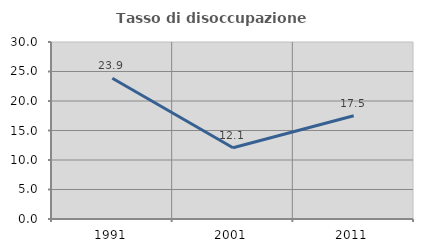
| Category | Tasso di disoccupazione giovanile  |
|---|---|
| 1991.0 | 23.853 |
| 2001.0 | 12.075 |
| 2011.0 | 17.5 |